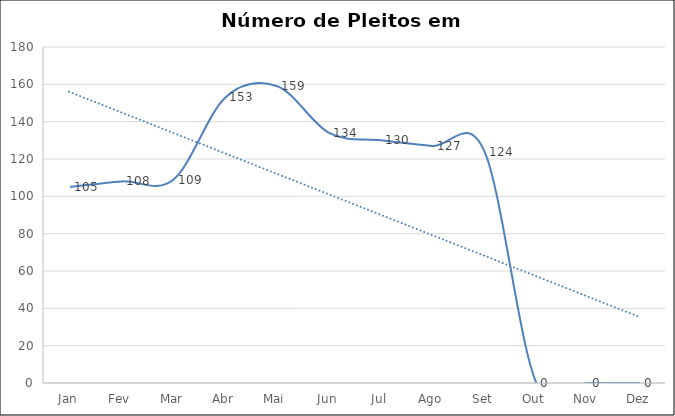
| Category | Carteira de PPBs |
|---|---|
| Jan | 105 |
| Fev | 108 |
| Mar | 109 |
| Abr | 153 |
| Mai | 159 |
| Jun | 134 |
| Jul | 130 |
| Ago | 127 |
| Set | 124 |
| Out | 0 |
| Nov | 0 |
| Dez | 0 |